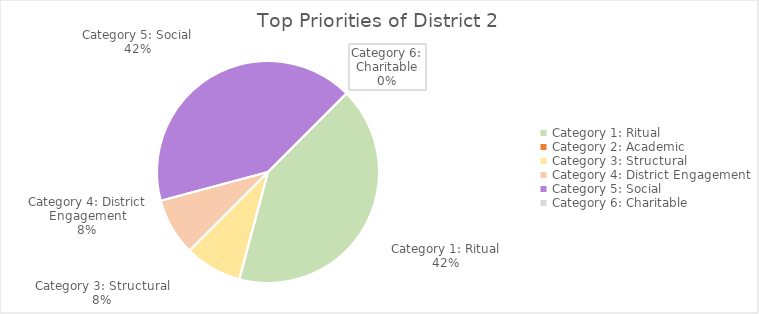
| Category | Top Priority |
|---|---|
| Category 1: Ritual | 5 |
| Category 2: Academic | 0 |
| Category 3: Structural | 1 |
| Category 4: District Engagement | 1 |
| Category 5: Social | 5 |
| Category 6: Charitable | 0 |